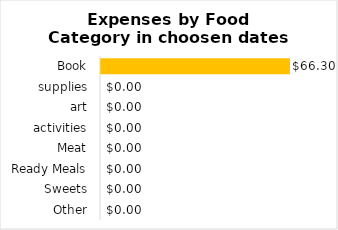
| Category | Expenses |
|---|---|
| Book | 66.3 |
| supplies | 0 |
| art | 0 |
| activities | 0 |
| Meat | 0 |
| Ready Meals | 0 |
| Sweets | 0 |
| Other | 0 |